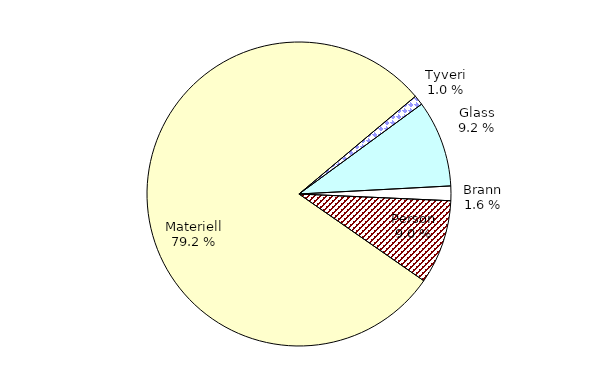
| Category | Series 0 |
|---|---|
| Tyveri | 95.155 |
| Glass | 837.089 |
| Brann | 141.445 |
| Person | 813.887 |
| Materiell | 7195.487 |